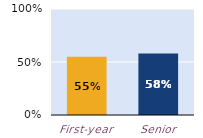
| Category | substantially |
|---|---|
| First-year | 0.549 |
| Senior | 0.581 |